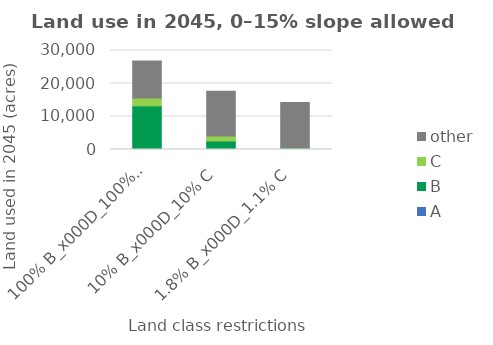
| Category | A | B | C | other |
|---|---|---|---|---|
| 100% B_x000d_100% C | 0 | 13218.322 | 2418.907 | 11180.001 |
| 10% B_x000d_10% C | 0 | 2586.153 | 1496.751 | 13588.931 |
| 1.8% B_x000d_1.1% C | 0 | 465.507 | 164.643 | 13604.894 |